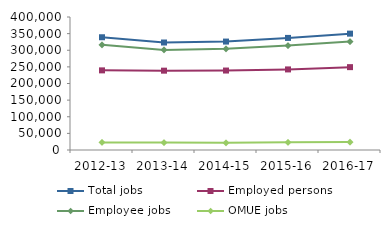
| Category | Total jobs | Employed persons | Employee jobs | OMUE jobs |
|---|---|---|---|---|
| 2012-13 | 339109 | 239477 | 316309 | 22800 |
| 2013-14 | 323270 | 238599 | 300980 | 22290 |
| 2014-15 | 326104 | 238997 | 304340 | 21764 |
| 2015-16 | 337104 | 242338 | 313952 | 23152 |
| 2016-17 | 349956 | 249206 | 326206 | 23750 |